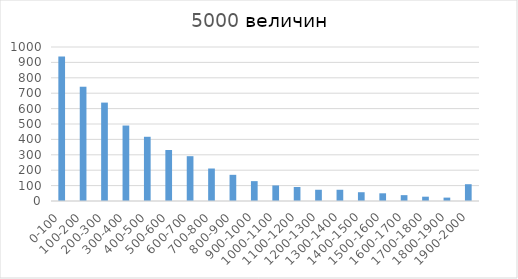
| Category | Series 0 |
|---|---|
| 0-100 | 938 |
| 100-200 | 742 |
| 200-300 | 639 |
| 300-400 | 490 |
| 400-500 | 417 |
| 500-600 | 331 |
| 600-700 | 291 |
| 700-800 | 211 |
| 800-900 | 170 |
| 900-1000 | 129 |
| 1000-1100 | 101 |
| 1100-1200 | 91 |
| 1200-1300 | 73 |
| 1300-1400 | 73 |
| 1400-1500 | 57 |
| 1500-1600 | 50 |
| 1600-1700 | 38 |
| 1700-1800 | 28 |
| 1800-1900 | 22 |
| 1900-2000 | 109 |